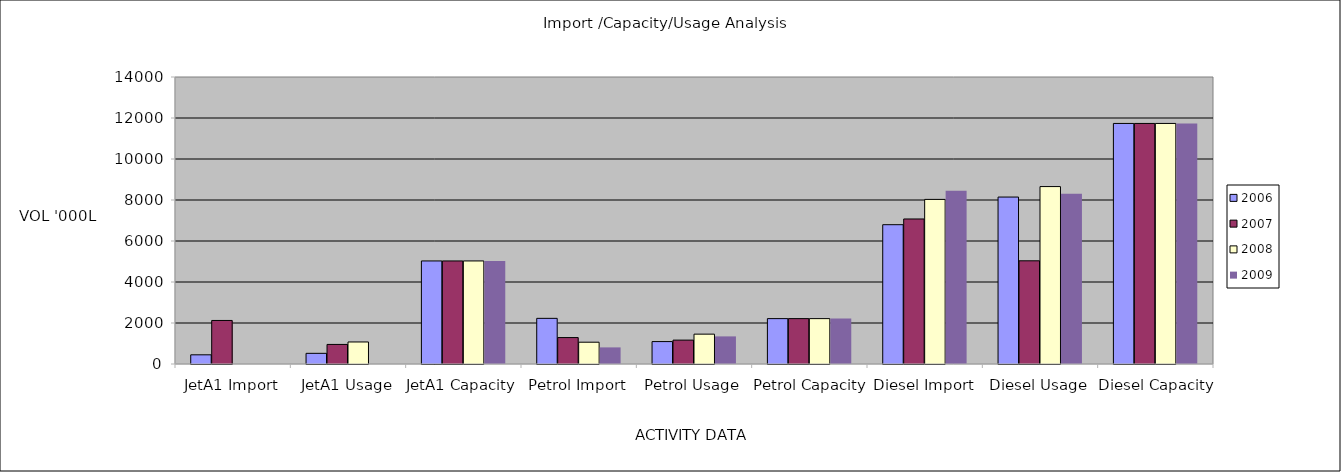
| Category | 2006 | 2007 | 2008 | 2009 |
|---|---|---|---|---|
| JetA1 Import | 448 | 2124 | 0 | 0 |
| JetA1 Usage | 520 | 955 | 1074 | 0 |
| JetA1 Capacity | 5027 | 5027 | 5027 | 5027 |
| Petrol Import | 2227 | 1289 | 1063 | 810 |
| Petrol Usage | 1093 | 1165 | 1456 | 1347 |
| Petrol Capacity | 2214 | 2214 | 2214 | 2214 |
| Diesel Import | 6795 | 7074 | 8029 | 8455 |
| Diesel Usage | 8144 | 5034 | 8655 | 8308 |
| Diesel Capacity | 11734 | 11734 | 11734 | 11734 |